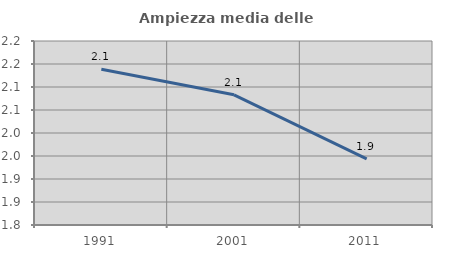
| Category | Ampiezza media delle famiglie |
|---|---|
| 1991.0 | 2.139 |
| 2001.0 | 2.083 |
| 2011.0 | 1.944 |